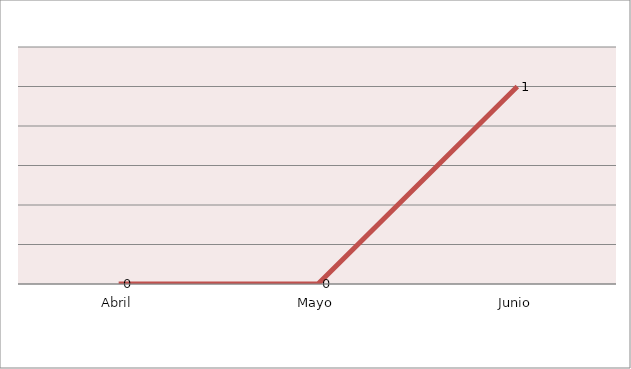
| Category | Series 0 |
|---|---|
| Abril | 0 |
| Mayo | 0 |
| Junio | 1 |